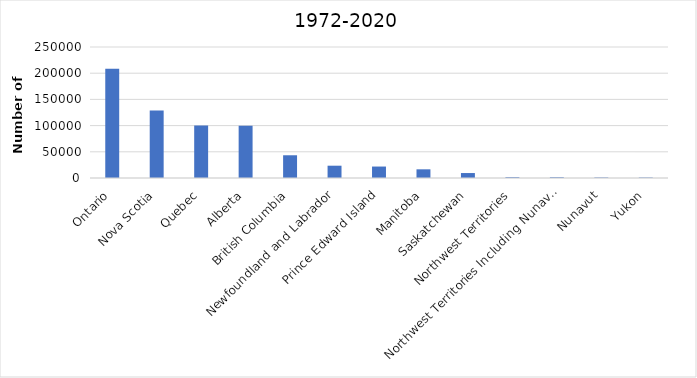
| Category | Series 0 |
|---|---|
| Ontario | 208638 |
| Nova Scotia | 128603 |
| Quebec | 100195 |
| Alberta | 99744 |
| British Columbia | 43390 |
| Newfoundland and Labrador | 23472 |
| Prince Edward Island | 21856 |
| Manitoba | 16559 |
| Saskatchewan | 9461 |
| Northwest Territories | 1582 |
| Northwest Territories Including Nunavut | 1458 |
| Nunavut | 966 |
| Yukon | 893 |